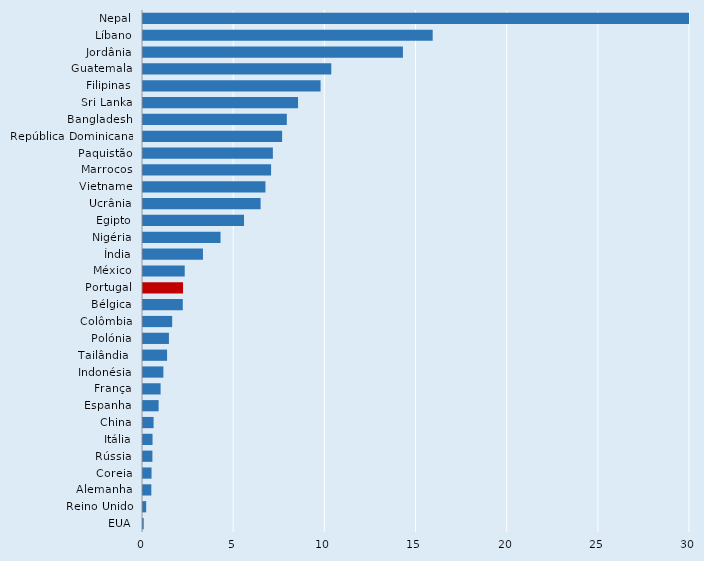
| Category | Series 0 |
|---|---|
| Nepal | 31.753 |
| Líbano | 15.888 |
| Jordânia | 14.256 |
| Guatemala | 10.326 |
| Filipinas | 9.739 |
| Sri Lanka | 8.503 |
| Bangladesh | 7.888 |
| República Dominicana | 7.63 |
| Paquistão | 7.123 |
| Marrocos | 7.025 |
| Vietname | 6.715 |
| Ucrânia | 6.45 |
| Egipto | 5.54 |
| Nigéria | 4.253 |
| Índia | 3.289 |
| México | 2.288 |
| Portugal | 2.196 |
| Bélgica | 2.183 |
| Colômbia | 1.6 |
| Polónia | 1.422 |
| Tailândia  | 1.32 |
| Indonésia | 1.117 |
| França | 0.965 |
| Espanha | 0.857 |
| China | 0.581 |
| Itália | 0.522 |
| Rússia | 0.516 |
| Coreia | 0.468 |
| Alemanha | 0.457 |
| Reino Unido | 0.175 |
| EUA | 0.039 |